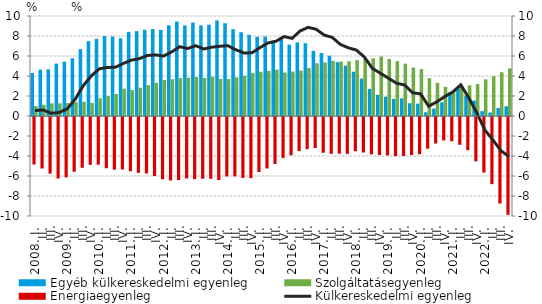
| Category | Egyéb külkereskedelmi egyenleg | Szolgáltatásegyenleg |
|---|---|---|
| 2008. I. | 4.299 | 0.991 |
|          II. | 4.634 | 1.126 |
|          III. | 4.673 | 1.261 |
|          IV. | 5.232 | 1.264 |
| 2009. I. | 5.436 | 1.297 |
|          II. | 5.771 | 1.387 |
|          III. | 6.679 | 1.424 |
|          IV. | 7.484 | 1.307 |
| 2010. I. | 7.713 | 1.775 |
|          II. | 7.991 | 1.992 |
|          III. | 7.944 | 2.199 |
|          IV. | 7.776 | 2.729 |
| 2011. I. | 8.414 | 2.594 |
|          II. | 8.486 | 2.83 |
|          III. | 8.617 | 3.083 |
|          IV. | 8.696 | 3.32 |
| 2012. I. | 8.607 | 3.608 |
|          II. | 9.073 | 3.681 |
|          III. | 9.448 | 3.782 |
|          IV. | 9.061 | 3.828 |
| 2013. I. | 9.341 | 3.903 |
| II. | 9.06 | 3.811 |
|          III. | 9.126 | 3.931 |
| IV. | 9.561 | 3.711 |
| 2014. I. | 9.279 | 3.702 |
| II. | 8.69 | 3.872 |
|          III. | 8.379 | 4.019 |
| IV. | 8.117 | 4.317 |
| 2015. I. | 7.912 | 4.429 |
| II. | 7.955 | 4.501 |
|          III. | 7.544 | 4.636 |
| IV. | 7.681 | 4.351 |
| 2016. I. | 7.139 | 4.446 |
| II. | 7.362 | 4.537 |
|          III. | 7.281 | 4.801 |
| IV. | 6.509 | 5.268 |
| 2017. I. | 6.306 | 5.358 |
| II. | 6.029 | 5.515 |
|          III. | 5.387 | 5.445 |
| IV. | 5.033 | 5.471 |
| 2018. I. | 4.429 | 5.587 |
| II. | 3.744 | 5.699 |
|          III. | 2.718 | 5.775 |
| IV. | 2.118 | 5.944 |
| 2019. I. | 1.924 | 5.699 |
| II. | 1.706 | 5.486 |
|          III. | 1.772 | 5.23 |
| IV. | 1.275 | 4.844 |
| 2020. I. | 1.238 | 4.692 |
| II. | 0.37 | 3.78 |
|          III. | 0.742 | 3.316 |
| IV. | 1.371 | 2.908 |
| 2021. I. | 2.357 | 2.468 |
| II. | 2.901 | 2.996 |
|          III. | 2.043 | 3.072 |
| IV. | 1.556 | 3.196 |
| 2022. I. | 0.482 | 3.668 |
| II. | 0.349 | 3.975 |
|          III. | 0.799 | 4.373 |
| IV. | 0.976 | 4.759 |